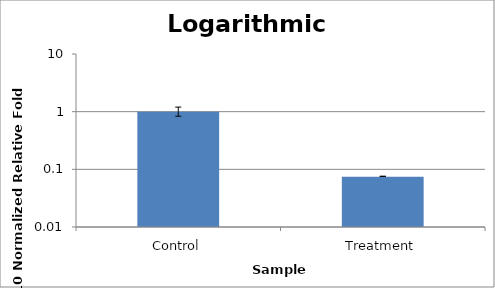
| Category | Series 0 |
|---|---|
| Control | 1 |
| Treatment | 0.074 |